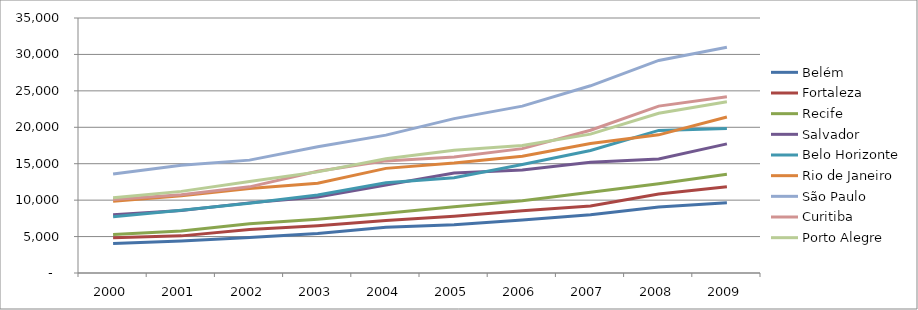
| Category | Belém | Fortaleza | Recife | Salvador | Belo Horizonte | Rio de Janeiro | São Paulo | Curitiba | Porto Alegre |
|---|---|---|---|---|---|---|---|---|---|
| 2000.0 | 4056.92 | 4830.78 | 5294.08 | 8002.04 | 7736.09 | 9834.49 | 13602.2 | 10074.53 | 10335.52 |
| 2001.0 | 4397.64 | 5096.13 | 5769.11 | 8569.23 | 8621.24 | 10606.09 | 14798.15 | 10754.3 | 11202.55 |
| 2002.0 | 4864.42 | 5958.78 | 6758.3 | 9625.55 | 9584.38 | 11602.22 | 15491.82 | 11823.31 | 12547.52 |
| 2003.0 | 5426.38 | 6483.7 | 7379.16 | 10438.88 | 10702.04 | 12312.55 | 17324.62 | 13963.39 | 13878 |
| 2004.0 | 6286.37 | 7199.19 | 8206.12 | 12081.13 | 12397.54 | 14361.68 | 18924.29 | 15388.81 | 15687.65 |
| 2005.0 | 6633.76 | 7781.8 | 9085.03 | 13731.65 | 13074.54 | 15082.83 | 21190.23 | 15908.08 | 16860.55 |
| 2006.0 | 7259.4 | 8538.67 | 9907.36 | 14128.33 | 14905.27 | 16030.43 | 22904.46 | 17072.12 | 17493.72 |
| 2007.0 | 8009.84 | 9195.27 | 11077.03 | 15202.84 | 16811.06 | 17767.57 | 25694.3 | 19595.93 | 19062.45 |
| 2008.0 | 9061.67 | 10829.41 | 12258.94 | 15654.83 | 19573.6 | 18962.27 | 29173.76 | 22907.21 | 21933.86 |
| 2009.0 | 9627.57 | 11846.28 | 13551.27 | 17721.71 | 19839.07 | 21418.52 | 30998.53 | 24182.79 | 23496.78 |